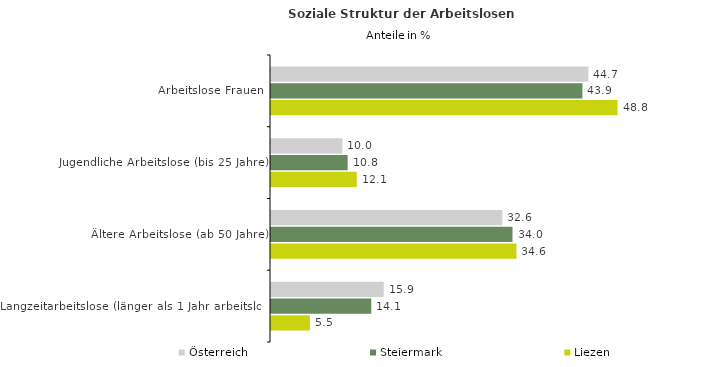
| Category | Österreich | Steiermark | Liezen |
|---|---|---|---|
| Arbeitslose Frauen | 44.699 | 43.86 | 48.809 |
| Jugendliche Arbeitslose (bis 25 Jahre) | 10.046 | 10.794 | 12.078 |
| Ältere Arbeitslose (ab 50 Jahre) | 32.578 | 34.015 | 34.571 |
| Langzeitarbeitslose (länger als 1 Jahr arbeitslos) | 15.879 | 14.12 | 5.485 |